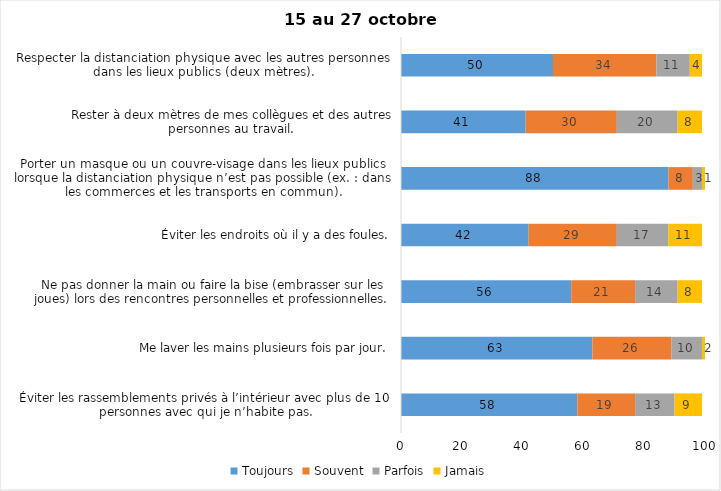
| Category | Toujours | Souvent | Parfois | Jamais |
|---|---|---|---|---|
| Éviter les rassemblements privés à l’intérieur avec plus de 10 personnes avec qui je n’habite pas. | 58 | 19 | 13 | 9 |
| Me laver les mains plusieurs fois par jour. | 63 | 26 | 10 | 2 |
| Ne pas donner la main ou faire la bise (embrasser sur les joues) lors des rencontres personnelles et professionnelles. | 56 | 21 | 14 | 8 |
| Éviter les endroits où il y a des foules. | 42 | 29 | 17 | 11 |
| Porter un masque ou un couvre-visage dans les lieux publics lorsque la distanciation physique n’est pas possible (ex. : dans les commerces et les transports en commun). | 88 | 8 | 3 | 1 |
| Rester à deux mètres de mes collègues et des autres personnes au travail. | 41 | 30 | 20 | 8 |
| Respecter la distanciation physique avec les autres personnes dans les lieux publics (deux mètres). | 50 | 34 | 11 | 4 |